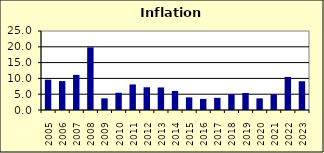
| Category | 5.3 |
|---|---|
| 2005.0 | 9.599 |
| 2006.0 | 9.14 |
| 2007.0 | 11.127 |
| 2008.0 | 19.826 |
| 2009.0 | 3.687 |
| 2010.0 | 5.455 |
| 2011.0 | 8.082 |
| 2012.0 | 7.194 |
| 2013.0 | 7.136 |
| 2014.0 | 6.036 |
| 2015.0 | 3.997 |
| 2016.0 | 3.524 |
| 2017.0 | 3.851 |
| 2018.0 | 4.947 |
| 2019.0 | 5.376 |
| 2020.0 | 3.682 |
| 2021.0 | 4.928 |
| 2022.0 | 10.47 |
| 2023.0 | 9.094 |